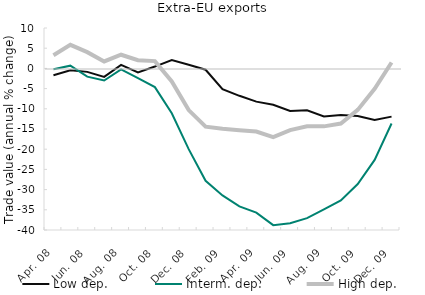
| Category | Low dep. | Interm. dep. | High dep. |
|---|---|---|---|
| Apr. 08 | -1.678 | -0.229 | 3.248 |
| May 08 | -0.459 | 0.676 | 5.835 |
| Jun. 08 | -0.86 | -2.047 | 4.023 |
| Jul. 08 | -2.106 | -2.998 | 1.719 |
| Aug. 08 | 0.861 | -0.237 | 3.382 |
| Sept. 08 | -0.977 | -2.389 | 2.037 |
| Oct. 08 | 0.455 | -4.628 | 1.803 |
| Nov. 08 | 2.049 | -11.117 | -3.215 |
| Dec. 08 | 0.906 | -19.993 | -10.319 |
| Jan. 09 | -0.329 | -27.823 | -14.428 |
| Feb. 09 | -5.119 | -31.439 | -14.957 |
| Mar. 09 | -6.784 | -34.141 | -15.333 |
| Apr. 09 | -8.22 | -35.701 | -15.642 |
| May 09 | -9.003 | -38.796 | -17.002 |
| Jun. 09 | -10.551 | -38.333 | -15.265 |
| Jul. 09 | -10.383 | -37.06 | -14.316 |
| Aug. 09 | -11.897 | -34.909 | -14.347 |
| Sept. 09 | -11.509 | -32.682 | -13.658 |
| Oct. 09 | -11.787 | -28.609 | -10.274 |
| Nov. 09 | -12.76 | -22.644 | -5.057 |
| Dec. 09 | -11.941 | -13.65 | 1.468 |